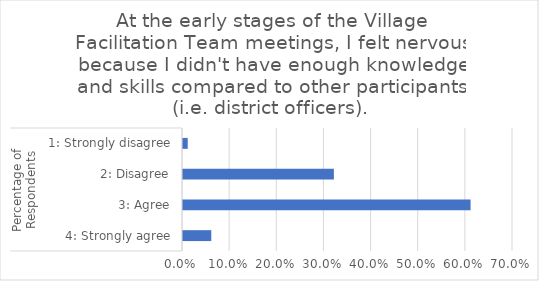
| Category | At the early stages of the Village Facilitation Team meetings, I felt nervous because I didn't have enough knowledge and skills compared to other participants (i.e. district officers). |
|---|---|
| 0 | 0.06 |
| 1 | 0.61 |
| 2 | 0.32 |
| 3 | 0.01 |